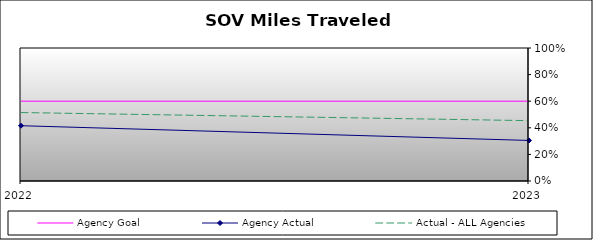
| Category | Agency Goal | Agency Actual | Actual - ALL Agencies |
|---|---|---|---|
| 2022.0 | 0.6 | 0.416 | 0.515 |
| 2023.0 | 0.6 | 0.305 | 0.454 |